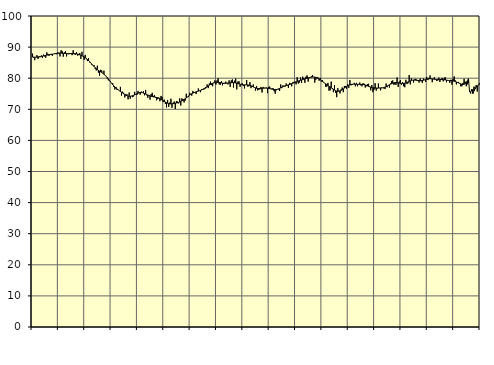
| Category | Piggar | Series 1 |
|---|---|---|
| nan | 87.9 | 86.78 |
| 87.0 | 86.6 | 86.79 |
| 87.0 | 85.8 | 86.75 |
| 87.0 | 86.8 | 86.76 |
| 87.0 | 87.4 | 86.77 |
| 87.0 | 86.2 | 86.8 |
| 87.0 | 87.1 | 86.84 |
| 87.0 | 86.8 | 86.9 |
| 87.0 | 87.3 | 86.98 |
| 87.0 | 86.5 | 87.07 |
| 87.0 | 87.6 | 87.17 |
| 87.0 | 87 | 87.26 |
| nan | 86.6 | 87.34 |
| 88.0 | 88.3 | 87.41 |
| 88.0 | 87.8 | 87.49 |
| 88.0 | 87.2 | 87.55 |
| 88.0 | 87.7 | 87.61 |
| 88.0 | 87.8 | 87.67 |
| 88.0 | 87.2 | 87.73 |
| 88.0 | 87.8 | 87.78 |
| 88.0 | 87.9 | 87.84 |
| 88.0 | 88.1 | 87.9 |
| 88.0 | 87.7 | 87.96 |
| 88.0 | 88.3 | 88.01 |
| nan | 88.2 | 88.05 |
| 89.0 | 87 | 88.07 |
| 89.0 | 89 | 88.07 |
| 89.0 | 88.7 | 88.04 |
| 89.0 | 86.9 | 88.01 |
| 89.0 | 88.3 | 87.97 |
| 89.0 | 88.7 | 87.94 |
| 89.0 | 87 | 87.91 |
| 89.0 | 88 | 87.9 |
| 89.0 | 87.7 | 87.9 |
| 89.0 | 88 | 87.91 |
| 89.0 | 88 | 87.92 |
| nan | 87.4 | 87.93 |
| 90.0 | 89 | 87.93 |
| 90.0 | 87.7 | 87.91 |
| 90.0 | 87.5 | 87.88 |
| 90.0 | 88.4 | 87.82 |
| 90.0 | 87.3 | 87.75 |
| 90.0 | 87.4 | 87.66 |
| 90.0 | 88.1 | 87.54 |
| 90.0 | 86.2 | 87.41 |
| 90.0 | 88.5 | 87.25 |
| 90.0 | 87.2 | 87.06 |
| 90.0 | 85.9 | 86.85 |
| nan | 87.5 | 86.6 |
| 91.0 | 86.1 | 86.32 |
| 91.0 | 85.5 | 86.01 |
| 91.0 | 86.4 | 85.67 |
| 91.0 | 85.1 | 85.31 |
| 91.0 | 84.9 | 84.93 |
| 91.0 | 84.3 | 84.53 |
| 91.0 | 84.2 | 84.14 |
| 91.0 | 84.2 | 83.75 |
| 91.0 | 83 | 83.38 |
| 91.0 | 82.5 | 83.05 |
| 91.0 | 84 | 82.76 |
| nan | 81.8 | 82.5 |
| 92.0 | 80.8 | 82.27 |
| 92.0 | 82.7 | 82.04 |
| 92.0 | 82.5 | 81.81 |
| 92.0 | 81.6 | 81.57 |
| 92.0 | 82.4 | 81.29 |
| 92.0 | 81 | 80.98 |
| 92.0 | 80.7 | 80.62 |
| 92.0 | 79.9 | 80.22 |
| 92.0 | 79.3 | 79.77 |
| 92.0 | 79.4 | 79.3 |
| 92.0 | 79.1 | 78.82 |
| nan | 78.3 | 78.35 |
| 93.0 | 78.4 | 77.92 |
| 93.0 | 77.2 | 77.53 |
| 93.0 | 76.4 | 77.17 |
| 93.0 | 77.2 | 76.84 |
| 93.0 | 76.2 | 76.54 |
| 93.0 | 76.2 | 76.26 |
| 93.0 | 76 | 75.99 |
| 93.0 | 77.2 | 75.73 |
| 93.0 | 74.4 | 75.48 |
| 93.0 | 75.7 | 75.23 |
| 93.0 | 75.3 | 74.98 |
| nan | 73.8 | 74.75 |
| 94.0 | 74.9 | 74.53 |
| 94.0 | 74.8 | 74.35 |
| 94.0 | 73.2 | 74.23 |
| 94.0 | 75.4 | 74.18 |
| 94.0 | 73.4 | 74.19 |
| 94.0 | 74.3 | 74.25 |
| 94.0 | 73.9 | 74.36 |
| 94.0 | 74.1 | 74.5 |
| 94.0 | 75.6 | 74.66 |
| 94.0 | 74.7 | 74.84 |
| 94.0 | 74.6 | 75.01 |
| nan | 75.9 | 75.17 |
| 95.0 | 75.4 | 75.3 |
| 95.0 | 74.7 | 75.38 |
| 95.0 | 75.7 | 75.39 |
| 95.0 | 75.3 | 75.33 |
| 95.0 | 75.8 | 75.21 |
| 95.0 | 74.5 | 75.07 |
| 95.0 | 76.2 | 74.91 |
| 95.0 | 74.5 | 74.74 |
| 95.0 | 73.7 | 74.59 |
| 95.0 | 74.6 | 74.45 |
| 95.0 | 73.1 | 74.31 |
| nan | 74.9 | 74.19 |
| 96.0 | 75.3 | 74.09 |
| 96.0 | 74.3 | 74.01 |
| 96.0 | 74.6 | 73.95 |
| 96.0 | 73.7 | 73.88 |
| 96.0 | 72.9 | 73.81 |
| 96.0 | 73.3 | 73.71 |
| 96.0 | 73.8 | 73.57 |
| 96.0 | 72.6 | 73.39 |
| 96.0 | 74.3 | 73.18 |
| 96.0 | 74 | 72.96 |
| 96.0 | 72.3 | 72.74 |
| nan | 73.1 | 72.54 |
| 97.0 | 71.7 | 72.33 |
| 97.0 | 70.6 | 72.14 |
| 97.0 | 73 | 71.97 |
| 97.0 | 70.8 | 71.84 |
| 97.0 | 72.2 | 71.76 |
| 97.0 | 73.4 | 71.73 |
| 97.0 | 70.5 | 71.74 |
| 97.0 | 72.1 | 71.79 |
| 97.0 | 72.5 | 71.86 |
| 97.0 | 70.1 | 71.93 |
| 97.0 | 72.6 | 72.02 |
| nan | 72.5 | 72.11 |
| 98.0 | 71.9 | 72.22 |
| 98.0 | 73.5 | 72.35 |
| 98.0 | 71.2 | 72.51 |
| 98.0 | 73.5 | 72.69 |
| 98.0 | 73.3 | 72.9 |
| 98.0 | 72.2 | 73.14 |
| 98.0 | 72.8 | 73.4 |
| 98.0 | 75 | 73.67 |
| 98.0 | 73.9 | 73.96 |
| 98.0 | 74 | 74.25 |
| 98.0 | 75.3 | 74.53 |
| nan | 75 | 74.78 |
| 99.0 | 74.4 | 75 |
| 99.0 | 75.9 | 75.2 |
| 99.0 | 75.3 | 75.36 |
| 99.0 | 75.4 | 75.5 |
| 99.0 | 74.9 | 75.61 |
| 99.0 | 75.8 | 75.72 |
| 99.0 | 76.7 | 75.83 |
| 99.0 | 76 | 75.95 |
| 99.0 | 75.5 | 76.08 |
| 99.0 | 76.5 | 76.24 |
| 99.0 | 76.5 | 76.43 |
| nan | 76.3 | 76.63 |
| 0.0 | 76.6 | 76.84 |
| 0.0 | 76.8 | 77.07 |
| 0.0 | 78 | 77.29 |
| 0.0 | 76.8 | 77.53 |
| 0.0 | 78.3 | 77.76 |
| 0.0 | 78.9 | 77.99 |
| 0.0 | 77.8 | 78.2 |
| 0.0 | 77.4 | 78.37 |
| 0.0 | 78.4 | 78.51 |
| 0.0 | 79.3 | 78.61 |
| 0.0 | 77.9 | 78.66 |
| nan | 79.3 | 78.68 |
| 1.0 | 80 | 78.67 |
| 1.0 | 78 | 78.63 |
| 1.0 | 77.9 | 78.57 |
| 1.0 | 79 | 78.5 |
| 1.0 | 77.7 | 78.44 |
| 1.0 | 78.2 | 78.38 |
| 1.0 | 78.5 | 78.35 |
| 1.0 | 78.9 | 78.35 |
| 1.0 | 78.3 | 78.39 |
| 1.0 | 78 | 78.44 |
| 1.0 | 79.3 | 78.49 |
| nan | 77.2 | 78.54 |
| 2.0 | 79.3 | 78.57 |
| 2.0 | 79.6 | 78.58 |
| 2.0 | 77 | 78.57 |
| 2.0 | 79.2 | 78.54 |
| 2.0 | 79.9 | 78.47 |
| 2.0 | 76.4 | 78.39 |
| 2.0 | 78.9 | 78.28 |
| 2.0 | 79 | 78.17 |
| 2.0 | 77.2 | 78.06 |
| 2.0 | 78.1 | 77.98 |
| 2.0 | 78.4 | 77.91 |
| nan | 77.5 | 77.87 |
| 3.0 | 76.7 | 77.86 |
| 3.0 | 77.8 | 77.85 |
| 3.0 | 79.4 | 77.84 |
| 3.0 | 77.3 | 77.82 |
| 3.0 | 77.4 | 77.77 |
| 3.0 | 78.7 | 77.68 |
| 3.0 | 76.8 | 77.55 |
| 3.0 | 77.3 | 77.39 |
| 3.0 | 78 | 77.21 |
| 3.0 | 77 | 77.03 |
| 3.0 | 76 | 76.89 |
| nan | 77.5 | 76.78 |
| 4.0 | 76.1 | 76.72 |
| 4.0 | 76.3 | 76.7 |
| 4.0 | 76.4 | 76.7 |
| 4.0 | 77.2 | 76.72 |
| 4.0 | 75.4 | 76.75 |
| 4.0 | 77.2 | 76.78 |
| 4.0 | 76.9 | 76.8 |
| 4.0 | 76.9 | 76.82 |
| 4.0 | 77 | 76.8 |
| 4.0 | 75.2 | 76.77 |
| 4.0 | 77.2 | 76.72 |
| nan | 77.3 | 76.65 |
| 5.0 | 76.5 | 76.57 |
| 5.0 | 76.7 | 76.49 |
| 5.0 | 76.8 | 76.42 |
| 5.0 | 75.8 | 76.37 |
| 5.0 | 75 | 76.36 |
| 5.0 | 76.1 | 76.38 |
| 5.0 | 76.4 | 76.45 |
| 5.0 | 76.4 | 76.57 |
| 5.0 | 75.9 | 76.72 |
| 5.0 | 78 | 76.9 |
| 5.0 | 76.8 | 77.09 |
| nan | 77.7 | 77.26 |
| 6.0 | 77.5 | 77.42 |
| 6.0 | 77.3 | 77.55 |
| 6.0 | 78.3 | 77.65 |
| 6.0 | 77.6 | 77.75 |
| 6.0 | 76.9 | 77.85 |
| 6.0 | 78.5 | 77.96 |
| 6.0 | 78.3 | 78.08 |
| 6.0 | 77.4 | 78.21 |
| 6.0 | 78.7 | 78.36 |
| 6.0 | 78.8 | 78.52 |
| 6.0 | 78.9 | 78.66 |
| nan | 78 | 78.81 |
| 7.0 | 80.3 | 78.95 |
| 7.0 | 78.3 | 79.09 |
| 7.0 | 78.6 | 79.22 |
| 7.0 | 80.2 | 79.34 |
| 7.0 | 78.5 | 79.46 |
| 7.0 | 80.5 | 79.57 |
| 7.0 | 80.1 | 79.67 |
| 7.0 | 78.5 | 79.79 |
| 7.0 | 80.5 | 79.9 |
| 7.0 | 80.9 | 80.01 |
| 7.0 | 78.9 | 80.11 |
| nan | 80 | 80.21 |
| 8.0 | 80.2 | 80.28 |
| 8.0 | 80.6 | 80.34 |
| 8.0 | 81 | 80.37 |
| 8.0 | 80.4 | 80.37 |
| 8.0 | 78.6 | 80.33 |
| 8.0 | 79.5 | 80.26 |
| 8.0 | 80.4 | 80.13 |
| 8.0 | 80.2 | 79.97 |
| 8.0 | 79.2 | 79.76 |
| 8.0 | 80.1 | 79.51 |
| 8.0 | 78.9 | 79.24 |
| nan | 79.4 | 78.97 |
| 9.0 | 78.8 | 78.7 |
| 9.0 | 78.4 | 78.43 |
| 9.0 | 77.2 | 78.18 |
| 9.0 | 77.3 | 77.94 |
| 9.0 | 78.5 | 77.69 |
| 9.0 | 76 | 77.45 |
| 9.0 | 76.1 | 77.2 |
| 9.0 | 78.9 | 76.94 |
| 9.0 | 76.5 | 76.68 |
| 9.0 | 75.5 | 76.43 |
| 9.0 | 77.8 | 76.19 |
| nan | 75.3 | 76 |
| 10.0 | 73.9 | 75.86 |
| 10.0 | 76.8 | 75.79 |
| 10.0 | 76 | 75.81 |
| 10.0 | 75.1 | 75.9 |
| 10.0 | 76.4 | 76.07 |
| 10.0 | 77 | 76.29 |
| 10.0 | 75.5 | 76.55 |
| 10.0 | 77.5 | 76.83 |
| 10.0 | 77.5 | 77.1 |
| 10.0 | 76.6 | 77.35 |
| 10.0 | 78 | 77.57 |
| nan | 76.9 | 77.74 |
| 11.0 | 79.4 | 77.88 |
| 11.0 | 77.7 | 77.99 |
| 11.0 | 77.9 | 78.04 |
| 11.0 | 78.1 | 78.07 |
| 11.0 | 78.5 | 78.09 |
| 11.0 | 77.4 | 78.08 |
| 11.0 | 78.5 | 78.07 |
| 11.0 | 77.4 | 78.05 |
| 11.0 | 78 | 78.03 |
| 11.0 | 78.6 | 78.01 |
| 11.0 | 77.7 | 78 |
| nan | 77.4 | 78 |
| 12.0 | 78.4 | 77.97 |
| 12.0 | 78.2 | 77.91 |
| 12.0 | 77 | 77.82 |
| 12.0 | 77.4 | 77.7 |
| 12.0 | 78.1 | 77.55 |
| 12.0 | 78.2 | 77.4 |
| 12.0 | 77.4 | 77.25 |
| 12.0 | 76.1 | 77.11 |
| 12.0 | 77.8 | 77.01 |
| 12.0 | 75.5 | 76.93 |
| 12.0 | 76.3 | 76.88 |
| nan | 78.4 | 76.85 |
| 13.0 | 76 | 76.84 |
| 13.0 | 76.7 | 76.84 |
| 13.0 | 78.3 | 76.85 |
| 13.0 | 76.8 | 76.87 |
| 13.0 | 76.1 | 76.88 |
| 13.0 | 77 | 76.89 |
| 13.0 | 76.9 | 76.92 |
| 13.0 | 76.7 | 76.99 |
| 13.0 | 76.5 | 77.11 |
| 13.0 | 78.3 | 77.27 |
| 13.0 | 77.1 | 77.47 |
| nan | 77.6 | 77.68 |
| 14.0 | 77 | 77.88 |
| 14.0 | 78.3 | 78.07 |
| 14.0 | 79.1 | 78.24 |
| 14.0 | 79.3 | 78.39 |
| 14.0 | 77.9 | 78.5 |
| 14.0 | 78 | 78.57 |
| 14.0 | 77.9 | 78.59 |
| 14.0 | 80.2 | 78.57 |
| 14.0 | 77.2 | 78.52 |
| 14.0 | 78.9 | 78.44 |
| 14.0 | 79.4 | 78.36 |
| nan | 77.9 | 78.31 |
| 15.0 | 78.7 | 78.3 |
| 15.0 | 77.4 | 78.33 |
| 15.0 | 77.1 | 78.4 |
| 15.0 | 79.5 | 78.5 |
| 15.0 | 78.1 | 78.64 |
| 15.0 | 78.4 | 78.81 |
| 15.0 | 81 | 78.99 |
| 15.0 | 78 | 79.16 |
| 15.0 | 80 | 79.29 |
| 15.0 | 79.4 | 79.37 |
| 15.0 | 78.6 | 79.41 |
| nan | 79.6 | 79.4 |
| 16.0 | 79.8 | 79.36 |
| 16.0 | 79.5 | 79.3 |
| 16.0 | 79.1 | 79.25 |
| 16.0 | 78.6 | 79.21 |
| 16.0 | 79.9 | 79.2 |
| 16.0 | 79 | 79.22 |
| 16.0 | 78.5 | 79.28 |
| 16.0 | 79.9 | 79.35 |
| 16.0 | 79.5 | 79.45 |
| 16.0 | 78.8 | 79.56 |
| 16.0 | 80.4 | 79.67 |
| nan | 79.4 | 79.76 |
| 17.0 | 80 | 79.82 |
| 17.0 | 80.9 | 79.84 |
| 17.0 | 79.8 | 79.83 |
| 17.0 | 78.7 | 79.78 |
| 17.0 | 79.8 | 79.72 |
| 17.0 | 80.3 | 79.65 |
| 17.0 | 79.5 | 79.59 |
| 17.0 | 79.1 | 79.55 |
| 17.0 | 79.3 | 79.53 |
| 17.0 | 80.2 | 79.53 |
| 17.0 | 78.8 | 79.55 |
| nan | 79.5 | 79.57 |
| 18.0 | 80.1 | 79.57 |
| 18.0 | 79 | 79.54 |
| 18.0 | 80.2 | 79.49 |
| 18.0 | 80.2 | 79.43 |
| 18.0 | 78.7 | 79.38 |
| 18.0 | 79.4 | 79.32 |
| 18.0 | 79.2 | 79.28 |
| 18.0 | 78.5 | 79.25 |
| 18.0 | 79.5 | 79.23 |
| 18.0 | 77.9 | 79.19 |
| 18.0 | 79.8 | 79.12 |
| nan | 80.6 | 79.03 |
| 19.0 | 79.3 | 78.92 |
| 19.0 | 78 | 78.79 |
| 19.0 | 78.7 | 78.64 |
| 19.0 | 78.8 | 78.48 |
| 19.0 | 78.2 | 78.31 |
| 19.0 | 77.4 | 78.16 |
| 19.0 | 77.4 | 78.05 |
| 19.0 | 78.5 | 78 |
| 19.0 | 79.8 | 78.06 |
| 19.0 | 78.9 | 78.26 |
| 19.0 | 77.4 | 78.63 |
| nan | 78 | 79.15 |
| 20.0 | 78.5 | 79.81 |
| 20.0 | 75.9 | 75.63 |
| 20.0 | 75.1 | 75.53 |
| 20.0 | 76 | 76.42 |
| 20.0 | 76.4 | 75.07 |
| 20.0 | 77.3 | 75.87 |
| 20.0 | 77.1 | 76.56 |
| 20.0 | 77.8 | 77.11 |
| 20.0 | 75.7 | 77.53 |
| 20.0 | 77.9 | 77.81 |
| 20.0 | 78.4 | 78.01 |